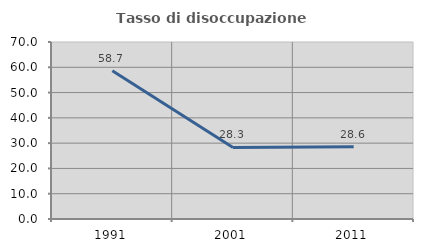
| Category | Tasso di disoccupazione giovanile  |
|---|---|
| 1991.0 | 58.654 |
| 2001.0 | 28.302 |
| 2011.0 | 28.571 |